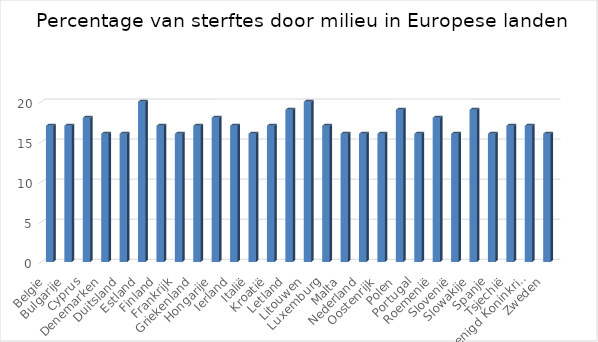
| Category | Series 0 |
|---|---|
| Belgie | 17 |
| Bulgarije | 17 |
| Cyprus | 18 |
| Denemarken | 16 |
| Duitsland | 16 |
| Estland | 20 |
| Finland | 17 |
| Frankrijk | 16 |
| Griekenland | 17 |
| Hongarije | 18 |
| Ierland | 17 |
| Italië | 16 |
| Kroatië | 17 |
| Letland | 19 |
| Litouwen | 20 |
| Luxemburg | 17 |
| Malta | 16 |
| Nederland | 16 |
| Oostenrijk | 16 |
| Polen | 19 |
| Portugal | 16 |
| Roemenië | 18 |
| Slovenië | 16 |
| Slowakije | 19 |
| Spanje | 16 |
| Tsjechië | 17 |
| Verenigd Koninkrijk | 17 |
| Zweden | 16 |